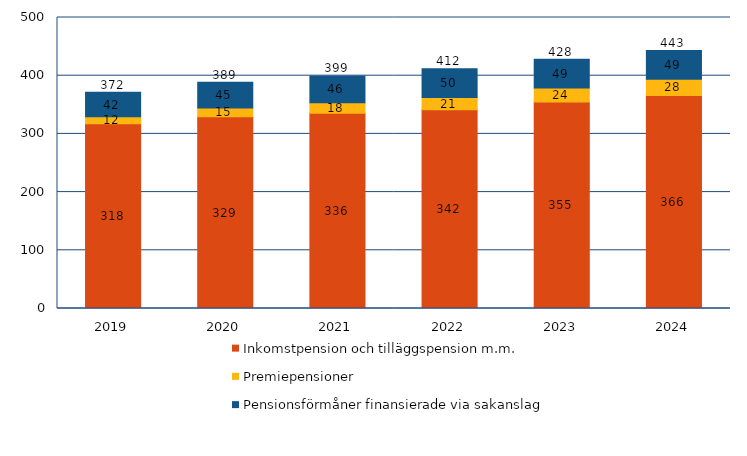
| Category | Inkomstpension och tilläggspension m.m. | Premiepensioner | Pensionsförmåner finansierade via sakanslag | Series 3 |
|---|---|---|---|---|
| 2019.0 | 317.628 | 11.715 | 42.22 | 371.563 |
| 2020.0 | 329.365 | 15.016 | 44.546 | 388.927 |
| 2021.0 | 335.587 | 17.869 | 46.039 | 399.495 |
| 2022.0 | 341.563 | 20.844 | 49.728 | 412.136 |
| 2023.0 | 354.893 | 24.13 | 49.321 | 428.344 |
| 2024.0 | 366.171 | 27.765 | 49.324 | 443.26 |